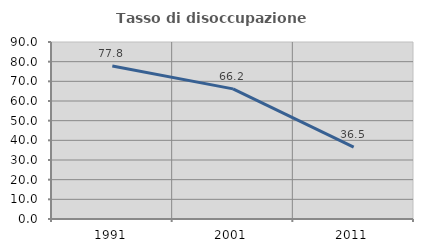
| Category | Tasso di disoccupazione giovanile  |
|---|---|
| 1991.0 | 77.81 |
| 2001.0 | 66.165 |
| 2011.0 | 36.527 |